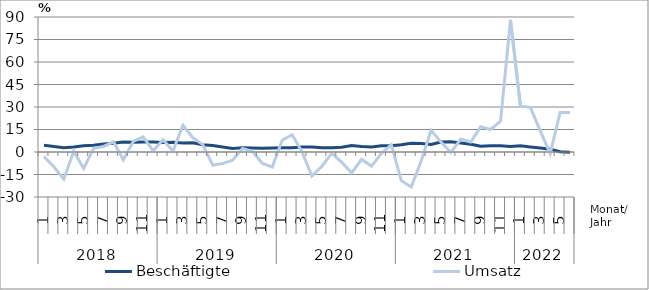
| Category | Beschäftigte | Umsatz |
|---|---|---|
| 0 | 4.5 | -3 |
| 1 | 3.6 | -9.8 |
| 2 | 2.9 | -18.1 |
| 3 | 3.4 | 0.5 |
| 4 | 4.2 | -11 |
| 5 | 4.5 | 2.5 |
| 6 | 5.3 | 3.7 |
| 7 | 5.8 | 6.8 |
| 8 | 6.6 | -5.2 |
| 9 | 6.5 | 7.1 |
| 10 | 6.6 | 10.1 |
| 11 | 6.6 | 0.8 |
| 12 | 6.4 | 8.2 |
| 13 | 6.5 | 0.6 |
| 14 | 6 | 17.8 |
| 15 | 6.1 | 9.6 |
| 16 | 4.9 | 4.9 |
| 17 | 4.3 | -8.8 |
| 18 | 3.3 | -7.7 |
| 19 | 2.4 | -5.4 |
| 20 | 2.8 | 2.4 |
| 21 | 2.7 | 0.5 |
| 22 | 2.5 | -7.6 |
| 23 | 2.7 | -10 |
| 24 | 2.9 | 7.8 |
| 25 | 2.9 | 11.5 |
| 26 | 3.4 | 0.1 |
| 27 | 3.4 | -16.1 |
| 28 | 2.9 | -9.5 |
| 29 | 2.9 | -0.8 |
| 30 | 3.1 | -6.9 |
| 31 | 4.3 | -14 |
| 32 | 3.6 | -4.9 |
| 33 | 3.4 | -9.4 |
| 34 | 4.1 | -0.9 |
| 35 | 4.1 | 4.9 |
| 36 | 4.8 | -19.1 |
| 37 | 5.8 | -23.3 |
| 38 | 5.6 | -6.1 |
| 39 | 5 | 14.4 |
| 40 | 6.6 | 6.6 |
| 41 | 6.9 | -0.3 |
| 42 | 6 | 8.7 |
| 43 | 5.2 | 6.7 |
| 44 | 3.8 | 16.9 |
| 45 | 4.2 | 15 |
| 46 | 4.2 | 20.6 |
| 47 | 3.7 | 88.1 |
| 48 | 4.1 | 30.7 |
| 49 | 3.4 | 29.8 |
| 50 | 2.6 | 14.1 |
| 51 | 1.9 | -1 |
| 52 | 0.2 | 26.4 |
| 53 | -0.1 | 26.3 |